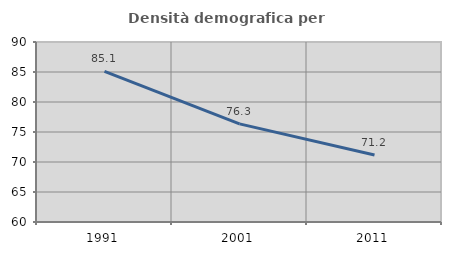
| Category | Densità demografica |
|---|---|
| 1991.0 | 85.092 |
| 2001.0 | 76.349 |
| 2011.0 | 71.177 |